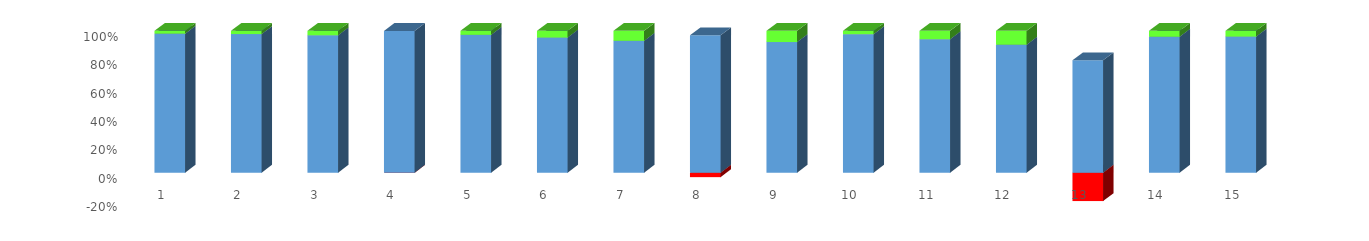
| Category | Series 0 | Series 1 |
|---|---|---|
| 0 | 608.35 | 12.15 |
| 1 | 1310.92 | 30.31 |
| 2 | 982.45 | 31.55 |
| 3 | 1317.02 | -1.3 |
| 4 | 1723.2 | 49.7 |
| 5 | 2123.2 | 104.92 |
| 6 | 1799.01 | 135.83 |
| 7 | 1822 | -59.05 |
| 8 | 2437.59 | 208.8 |
| 9 | 1921.16 | 45.79 |
| 10 | 2483.5 | 155.63 |
| 11 | 3999.61 | 432.51 |
| 12 | 3542.24 | -928.23 |
| 13 | 1785.66 | 77.06 |
| 14 | 2793.17 | 117.33 |